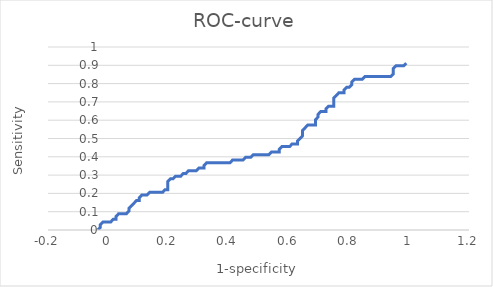
| Category | Series 0 |
|---|---|
| -0.034482758620689724 | 0 |
| -0.034482758620689724 | 0 |
| -0.02586206896551735 | 0.015 |
| -0.02586206896551735 | 0.015 |
| -0.02586206896551735 | 0.029 |
| -0.01724137931034475 | 0.044 |
| -0.008620689655172376 | 0.044 |
| 0.0 | 0.044 |
| 0.008620689655172376 | 0.044 |
| 0.008620689655172376 | 0.044 |
| 0.017241379310344862 | 0.059 |
| 0.025862068965517238 | 0.059 |
| 0.025862068965517238 | 0.059 |
| 0.025862068965517238 | 0.074 |
| 0.03448275862068961 | 0.088 |
| 0.0431034482758621 | 0.088 |
| 0.051724137931034475 | 0.088 |
| 0.06034482758620685 | 0.088 |
| 0.06034482758620685 | 0.088 |
| 0.06896551724137934 | 0.103 |
| 0.06896551724137934 | 0.103 |
| 0.06896551724137934 | 0.118 |
| 0.07758620689655171 | 0.132 |
| 0.07758620689655171 | 0.132 |
| 0.08620689655172409 | 0.147 |
| 0.08620689655172409 | 0.147 |
| 0.09482758620689657 | 0.162 |
| 0.10344827586206895 | 0.162 |
| 0.10344827586206895 | 0.162 |
| 0.10344827586206895 | 0.176 |
| 0.11206896551724133 | 0.191 |
| 0.12068965517241381 | 0.191 |
| 0.1293103448275862 | 0.191 |
| 0.1293103448275862 | 0.191 |
| 0.13793103448275867 | 0.206 |
| 0.14655172413793105 | 0.206 |
| 0.15517241379310343 | 0.206 |
| 0.1637931034482759 | 0.206 |
| 0.1724137931034483 | 0.206 |
| 0.18103448275862066 | 0.206 |
| 0.18103448275862066 | 0.206 |
| 0.18965517241379315 | 0.221 |
| 0.19827586206896552 | 0.221 |
| 0.19827586206896552 | 0.221 |
| 0.19827586206896552 | 0.235 |
| 0.19827586206896552 | 0.25 |
| 0.19827586206896552 | 0.265 |
| 0.2068965517241379 | 0.279 |
| 0.2155172413793104 | 0.279 |
| 0.2155172413793104 | 0.279 |
| 0.22413793103448276 | 0.294 |
| 0.23275862068965514 | 0.294 |
| 0.24137931034482762 | 0.294 |
| 0.24137931034482762 | 0.294 |
| 0.25 | 0.309 |
| 0.2586206896551724 | 0.309 |
| 0.2586206896551724 | 0.309 |
| 0.26724137931034486 | 0.324 |
| 0.27586206896551724 | 0.324 |
| 0.2844827586206896 | 0.324 |
| 0.2931034482758621 | 0.324 |
| 0.2931034482758621 | 0.324 |
| 0.3017241379310345 | 0.338 |
| 0.31034482758620685 | 0.338 |
| 0.31896551724137934 | 0.338 |
| 0.31896551724137934 | 0.338 |
| 0.31896551724137934 | 0.353 |
| 0.3275862068965517 | 0.368 |
| 0.3362068965517241 | 0.368 |
| 0.3448275862068966 | 0.368 |
| 0.35344827586206895 | 0.368 |
| 0.3620689655172413 | 0.368 |
| 0.3706896551724138 | 0.368 |
| 0.3793103448275862 | 0.368 |
| 0.3879310344827587 | 0.368 |
| 0.39655172413793105 | 0.368 |
| 0.4051724137931034 | 0.368 |
| 0.4051724137931034 | 0.368 |
| 0.4137931034482759 | 0.382 |
| 0.4224137931034483 | 0.382 |
| 0.43103448275862066 | 0.382 |
| 0.43965517241379315 | 0.382 |
| 0.4482758620689655 | 0.382 |
| 0.4482758620689655 | 0.382 |
| 0.4568965517241379 | 0.397 |
| 0.4655172413793104 | 0.397 |
| 0.47413793103448276 | 0.397 |
| 0.47413793103448276 | 0.397 |
| 0.48275862068965514 | 0.412 |
| 0.4913793103448276 | 0.412 |
| 0.5 | 0.412 |
| 0.5086206896551724 | 0.412 |
| 0.5172413793103448 | 0.412 |
| 0.5258620689655172 | 0.412 |
| 0.5344827586206897 | 0.412 |
| 0.5344827586206897 | 0.412 |
| 0.5431034482758621 | 0.426 |
| 0.5517241379310345 | 0.426 |
| 0.5603448275862069 | 0.426 |
| 0.5689655172413793 | 0.426 |
| 0.5689655172413793 | 0.426 |
| 0.5689655172413793 | 0.441 |
| 0.5775862068965517 | 0.456 |
| 0.5862068965517242 | 0.456 |
| 0.5948275862068966 | 0.456 |
| 0.603448275862069 | 0.456 |
| 0.603448275862069 | 0.456 |
| 0.6120689655172413 | 0.471 |
| 0.6206896551724138 | 0.471 |
| 0.6293103448275862 | 0.471 |
| 0.6293103448275862 | 0.471 |
| 0.6293103448275862 | 0.485 |
| 0.6379310344827587 | 0.5 |
| 0.6379310344827587 | 0.5 |
| 0.646551724137931 | 0.515 |
| 0.646551724137931 | 0.515 |
| 0.646551724137931 | 0.529 |
| 0.646551724137931 | 0.544 |
| 0.6551724137931034 | 0.559 |
| 0.6551724137931034 | 0.559 |
| 0.6637931034482758 | 0.574 |
| 0.6724137931034483 | 0.574 |
| 0.6810344827586207 | 0.574 |
| 0.6896551724137931 | 0.574 |
| 0.6896551724137931 | 0.574 |
| 0.6896551724137931 | 0.588 |
| 0.6896551724137931 | 0.603 |
| 0.6982758620689655 | 0.618 |
| 0.6982758620689655 | 0.618 |
| 0.6982758620689655 | 0.632 |
| 0.7068965517241379 | 0.647 |
| 0.7155172413793103 | 0.647 |
| 0.7241379310344828 | 0.647 |
| 0.7241379310344828 | 0.647 |
| 0.7241379310344828 | 0.662 |
| 0.7327586206896552 | 0.676 |
| 0.7413793103448276 | 0.676 |
| 0.75 | 0.676 |
| 0.75 | 0.676 |
| 0.75 | 0.691 |
| 0.75 | 0.706 |
| 0.75 | 0.721 |
| 0.7586206896551724 | 0.735 |
| 0.7586206896551724 | 0.735 |
| 0.7672413793103449 | 0.75 |
| 0.7758620689655172 | 0.75 |
| 0.7844827586206897 | 0.75 |
| 0.7844827586206897 | 0.75 |
| 0.7844827586206897 | 0.765 |
| 0.7931034482758621 | 0.779 |
| 0.8017241379310345 | 0.779 |
| 0.8017241379310345 | 0.779 |
| 0.8103448275862069 | 0.794 |
| 0.8103448275862069 | 0.794 |
| 0.8103448275862069 | 0.809 |
| 0.8189655172413793 | 0.824 |
| 0.8275862068965517 | 0.824 |
| 0.8362068965517242 | 0.824 |
| 0.8448275862068966 | 0.824 |
| 0.8448275862068966 | 0.824 |
| 0.853448275862069 | 0.838 |
| 0.8620689655172413 | 0.838 |
| 0.8706896551724138 | 0.838 |
| 0.8793103448275862 | 0.838 |
| 0.8879310344827587 | 0.838 |
| 0.896551724137931 | 0.838 |
| 0.9051724137931034 | 0.838 |
| 0.9137931034482758 | 0.838 |
| 0.9224137931034483 | 0.838 |
| 0.9310344827586207 | 0.838 |
| 0.9396551724137931 | 0.838 |
| 0.9396551724137931 | 0.838 |
| 0.9482758620689655 | 0.853 |
| 0.9482758620689655 | 0.853 |
| 0.9482758620689655 | 0.868 |
| 0.9482758620689655 | 0.882 |
| 0.9568965517241379 | 0.897 |
| 0.9655172413793104 | 0.897 |
| 0.9741379310344828 | 0.897 |
| 0.9827586206896551 | 0.897 |
| 0.9827586206896551 | 0.897 |
| 0.9913793103448276 | 0.912 |
| 0.9913793103448276 | 0.912 |